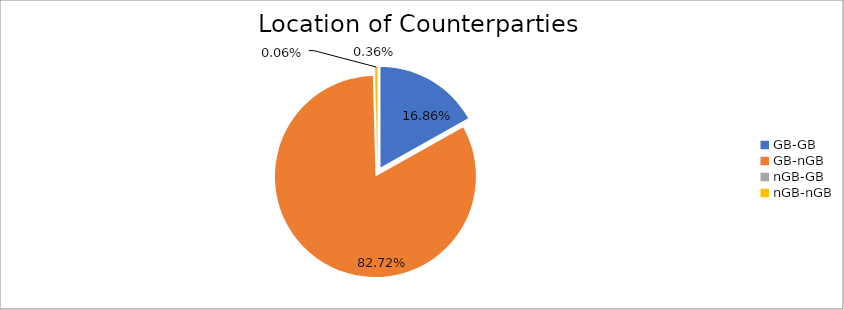
| Category | Series 0 |
|---|---|
| GB-GB | 1627237.688 |
| GB-nGB | 7982358.275 |
| nGB-GB | 5797.781 |
| nGB-nGB | 34608.987 |